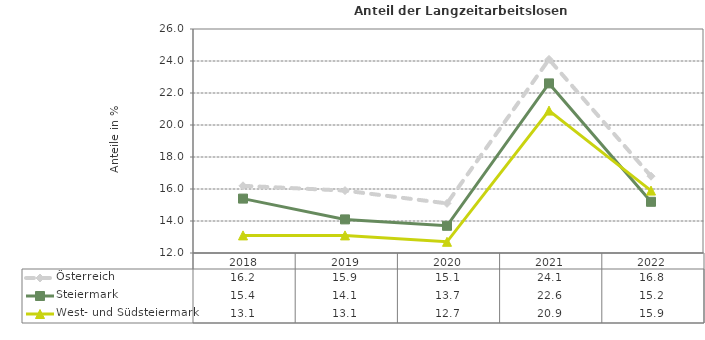
| Category | Österreich | Steiermark | West- und Südsteiermark |
|---|---|---|---|
| 2022.0 | 16.8 | 15.2 | 15.9 |
| 2021.0 | 24.1 | 22.6 | 20.9 |
| 2020.0 | 15.1 | 13.7 | 12.7 |
| 2019.0 | 15.9 | 14.1 | 13.1 |
| 2018.0 | 16.2 | 15.4 | 13.1 |